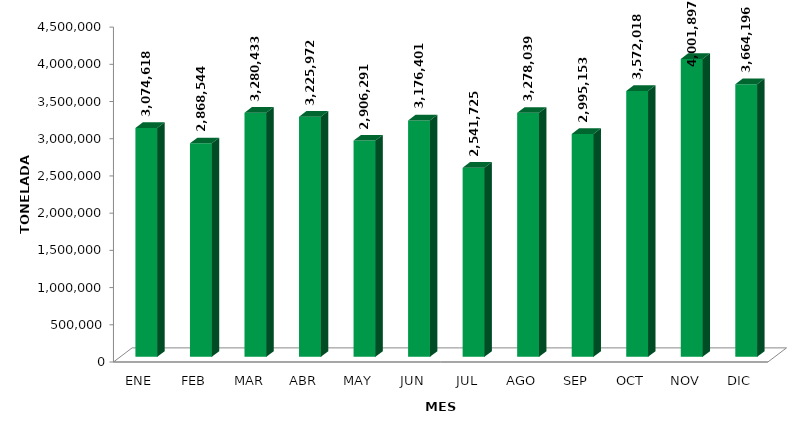
| Category | Series 0 |
|---|---|
| ENE | 3074618.16 |
| FEB | 2868544.31 |
| MAR | 3280432.715 |
| ABR | 3225972.081 |
| MAY | 2906291.297 |
| JUN | 3176400.745 |
| JUL | 2541724.58 |
| AGO | 3278038.831 |
| SEP | 2995153.219 |
| OCT | 3572017.615 |
| NOV | 4001897.39 |
| DIC | 3664195.887 |